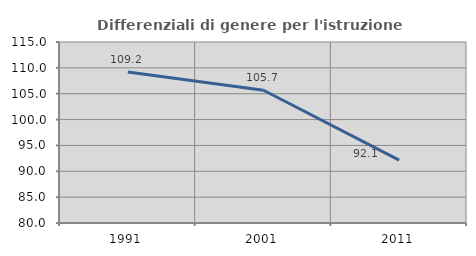
| Category | Differenziali di genere per l'istruzione superiore |
|---|---|
| 1991.0 | 109.22 |
| 2001.0 | 105.667 |
| 2011.0 | 92.15 |